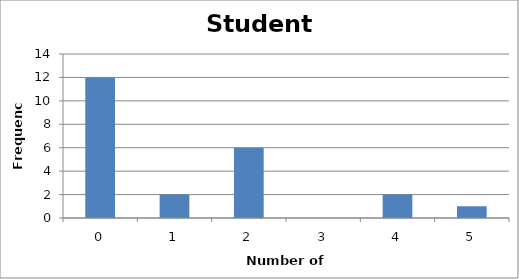
| Category | Series 0 |
|---|---|
| 0.0 | 12 |
| 1.0 | 2 |
| 2.0 | 6 |
| 3.0 | 0 |
| 4.0 | 2 |
| 5.0 | 1 |